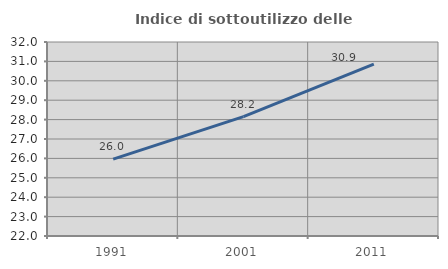
| Category | Indice di sottoutilizzo delle abitazioni  |
|---|---|
| 1991.0 | 25.96 |
| 2001.0 | 28.155 |
| 2011.0 | 30.861 |